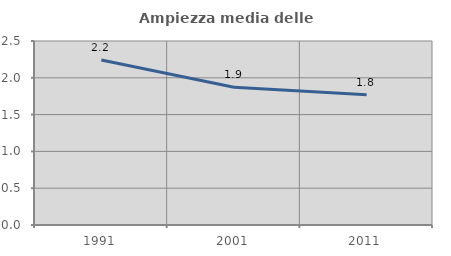
| Category | Ampiezza media delle famiglie |
|---|---|
| 1991.0 | 2.243 |
| 2001.0 | 1.872 |
| 2011.0 | 1.769 |